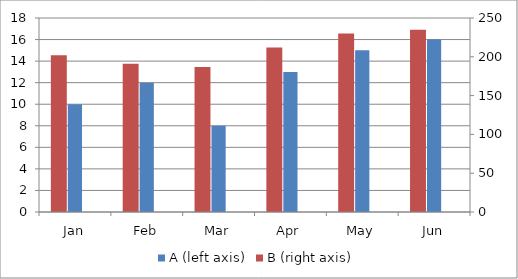
| Category | A (left axis) |
|---|---|
| Jan | 10 |
| Feb | 12 |
| Mar | 8 |
| Apr | 13 |
| May | 15 |
| Jun | 16 |